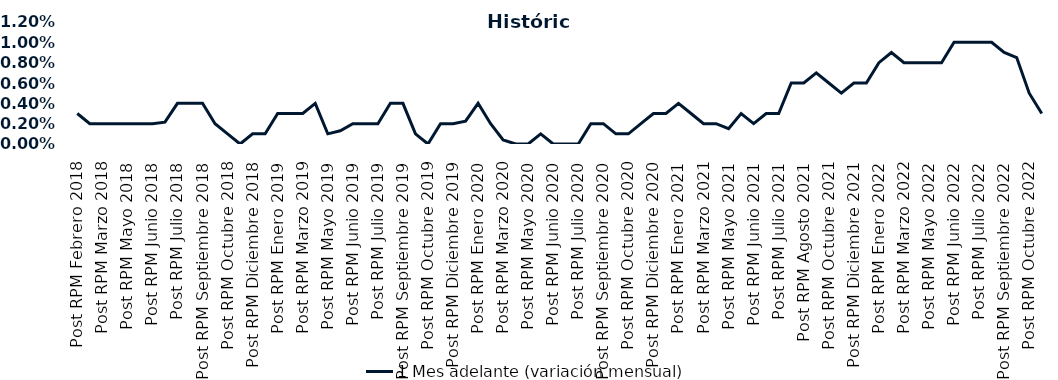
| Category | 1 Mes adelante (variación mensual) |
|---|---|
| Post RPM Febrero 2018 | 0.003 |
| Pre RPM Marzo 2018 | 0.002 |
| Post RPM Marzo 2018 | 0.002 |
| Pre RPM Mayo 2018 | 0.002 |
| Post RPM Mayo 2018 | 0.002 |
| Pre RPM Junio 2018 | 0.002 |
| Post RPM Junio 2018 | 0.002 |
| Pre RPM Julio 2018 | 0.002 |
| Post RPM Julio 2018 | 0.004 |
| Pre RPM Septiembre 2018 | 0.004 |
| Post RPM Septiembre 2018 | 0.004 |
| Pre RPM Octubre 2018 | 0.002 |
| Post RPM Octubre 2018 | 0.001 |
| Pre RPM Diciembre 2018 | 0 |
| Post RPM Diciembre 2018 | 0.001 |
| Pre RPM Enero 2019 | 0.001 |
| Post RPM Enero 2019 | 0.003 |
| Pre RPM Marzo 2019 | 0.003 |
| Post RPM Marzo 2019 | 0.003 |
| Pre RPM Mayo 2019 | 0.004 |
| Post RPM Mayo 2019 | 0.001 |
| Pre RPM Junio 2019 | 0.001 |
| Post RPM Junio 2019 | 0.002 |
| Pre RPM Julio 2019 | 0.002 |
| Post RPM Julio 2019 | 0.002 |
| Pre RPM Septiembre 2019 | 0.004 |
| Post RPM Septiembre 2019 | 0.004 |
| Pre RPM Octubre 2019 | 0.001 |
| Post RPM Octubre 2019 | 0 |
| Pre RPM Diciembre 2019 | 0.002 |
| Post RPM Diciembre 2019 | 0.002 |
| Pre RPM Enero 2020 | 0.002 |
| Post RPM Enero 2020 | 0.004 |
| Pre RPM Marzo 2020 | 0.002 |
| Post RPM Marzo 2020 | 0 |
| Pre RPM Mayo 2020 | 0 |
| Post RPM Mayo 2020 | 0 |
| Pre RPM Junio 2020 | 0.001 |
| Post RPM Junio 2020 | 0 |
| Pre RPM Julio 2020 | 0 |
| Post RPM Julio 2020 | 0 |
| Pre RPM Septiembre 2020 | 0.002 |
| Post RPM Septiembre 2020 | 0.002 |
| Pre RPM Octubre 2020 | 0.001 |
| Post RPM Octubre 2020 | 0.001 |
| Pre RPM Diciembre 2020 | 0.002 |
| Post RPM Diciembre 2020 | 0.003 |
| Pre RPM Enero 2021 | 0.003 |
| Post RPM Enero 2021 | 0.004 |
| Pre RPM Marzo 2021 | 0.003 |
| Post RPM Marzo 2021 | 0.002 |
| Pre RPM Mayo 2021 | 0.002 |
| Post RPM Mayo 2021 | 0.002 |
| Pre RPM Junio 2021 | 0.003 |
| Post RPM Junio 2021 | 0.002 |
| Pre RPM Julio 2021 | 0.003 |
| Post RPM Julio 2021 | 0.003 |
| Pre RPM Agosto 2021 | 0.006 |
| Post RPM Agosto 2021 | 0.006 |
| Pre RPM Octubre 2021 | 0.007 |
| Post RPM Octubre 2021 | 0.006 |
| Pre RPM Diciembre 2021 | 0.005 |
| Post RPM Diciembre 2021 | 0.006 |
| Pre RPM Enero 2022 | 0.006 |
| Post RPM Enero 2022 | 0.008 |
| Pre RPM Marzo 2022 | 0.009 |
| Post RPM Marzo 2022 | 0.008 |
| Pre RPM Mayo 2022 | 0.008 |
| Post RPM Mayo 2022 | 0.008 |
| Pre RPM Junio 2022 | 0.008 |
| Post RPM Junio 2022 | 0.01 |
| Pre RPM Julio 2022 | 0.01 |
| Post RPM Julio 2022 | 0.01 |
| Pre RPM Septiembre 2022 | 0.01 |
| Post RPM Septiembre 2022 | 0.009 |
| Pre RPM Octubre 2022 | 0.008 |
| Post RPM Octubre 2022 | 0.005 |
| Pre RPM Diciembre 2022 | 0.003 |